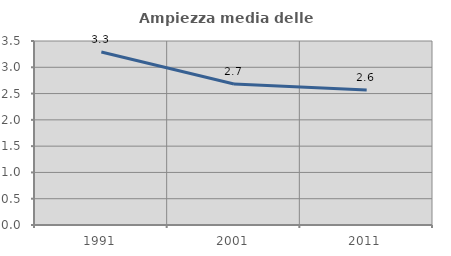
| Category | Ampiezza media delle famiglie |
|---|---|
| 1991.0 | 3.291 |
| 2001.0 | 2.681 |
| 2011.0 | 2.568 |